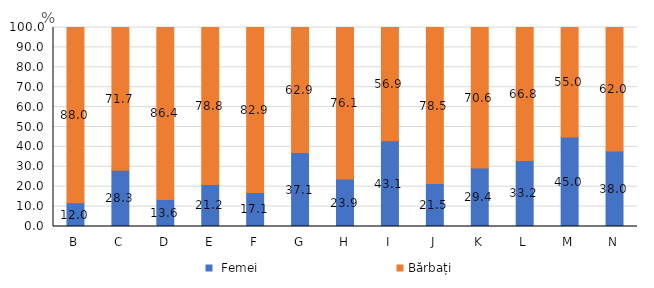
| Category |  Femei | Bărbați |
|---|---|---|
| B | 11.957 | 88.043 |
| C | 28.265 | 71.735 |
| D | 13.58 | 86.42 |
| E | 21.154 | 78.846 |
| F | 17.138 | 82.862 |
| G | 37.13 | 62.87 |
| H | 23.901 | 76.099 |
| I | 43.109 | 56.891 |
| J | 21.547 | 78.453 |
| K | 29.397 | 70.603 |
| L | 33.226 | 66.774 |
| M | 45.015 | 54.985 |
| N | 37.951 | 62.049 |